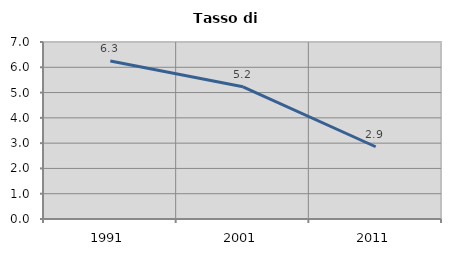
| Category | Tasso di disoccupazione   |
|---|---|
| 1991.0 | 6.25 |
| 2001.0 | 5.229 |
| 2011.0 | 2.857 |